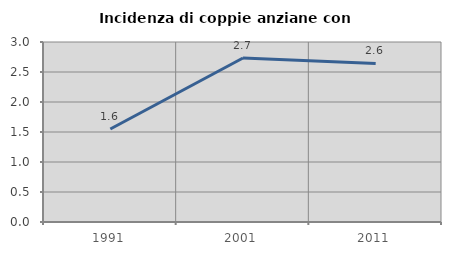
| Category | Incidenza di coppie anziane con figli |
|---|---|
| 1991.0 | 1.55 |
| 2001.0 | 2.734 |
| 2011.0 | 2.643 |